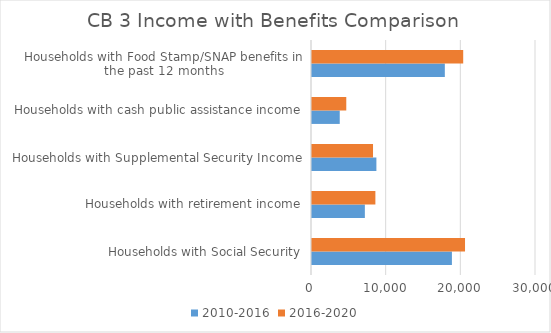
| Category | 2010-2016 | 2016-2020 |
|---|---|---|
| Households with Social Security | 18738 | 20494 |
| Households with retirement income | 7080 | 8489 |
| Households with Supplemental Security Income | 8624 | 8172 |
| Households with cash public assistance income | 3716 | 4591 |
| Households with Food Stamp/SNAP benefits in the past 12 months | 17790 | 20251 |